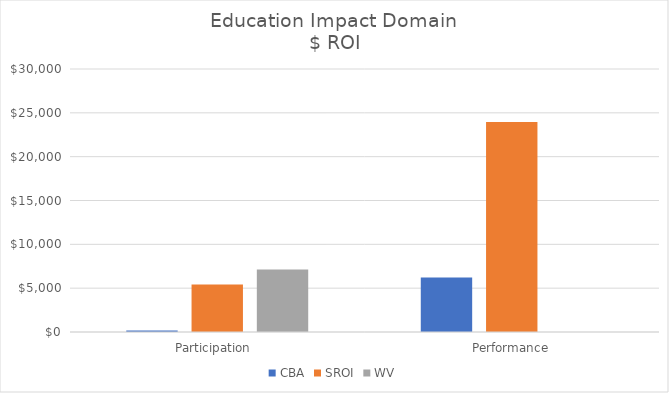
| Category | CBA | SROI | WV |
|---|---|---|---|
| Participation  | 168 | 5410.751 | 7119.6 |
| Performance | 6208.6 | 23948.396 | 0 |